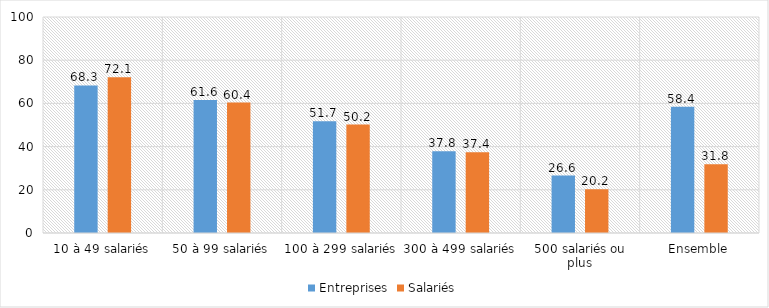
| Category | Entreprises | Salariés |
|---|---|---|
| 10 à 49 salariés | 68.3 | 72.1 |
| 50 à 99 salariés | 61.6 | 60.4 |
| 100 à 299 salariés | 51.7 | 50.2 |
| 300 à 499 salariés | 37.8 | 37.4 |
| 500 salariés ou plus | 26.6 | 20.2 |
| Ensemble | 58.4 | 31.8 |